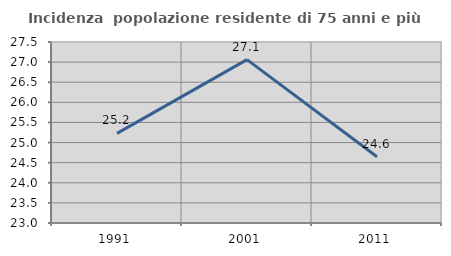
| Category | Incidenza  popolazione residente di 75 anni e più |
|---|---|
| 1991.0 | 25.229 |
| 2001.0 | 27.061 |
| 2011.0 | 24.648 |